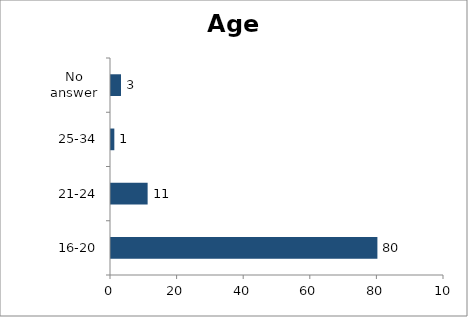
| Category | Age |
|---|---|
| 16-20 | 80 |
| 21-24 | 11 |
| 25-34 | 1 |
| No answer | 3 |